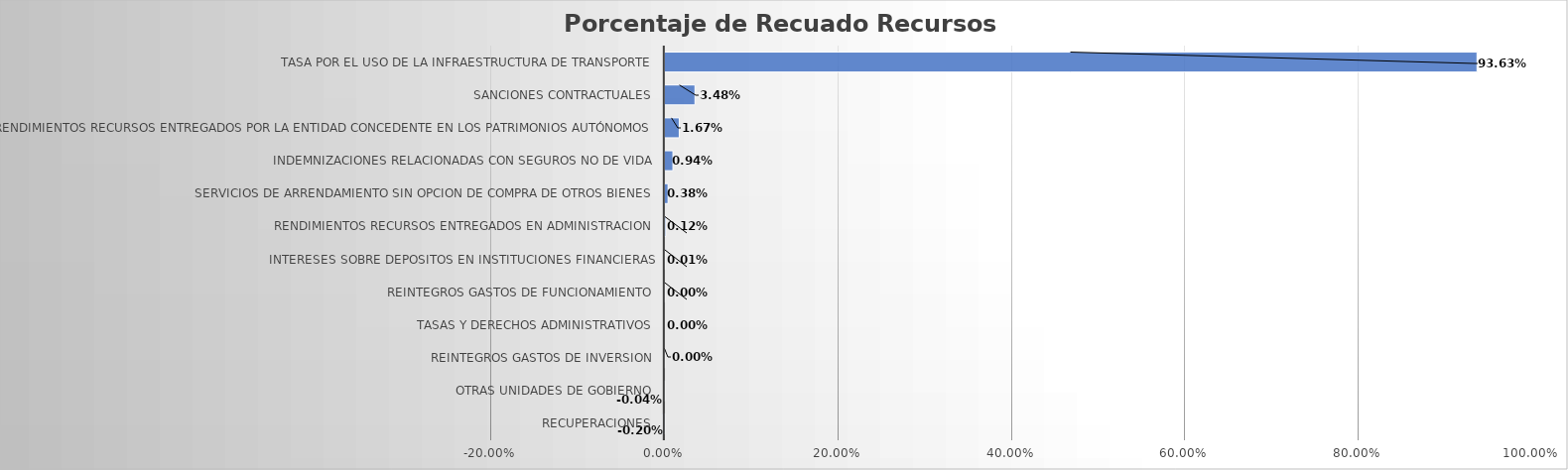
| Category | Total |
|---|---|
| RECUPERACIONES | -0.002 |
| OTRAS UNIDADES DE GOBIERNO | 0 |
| REINTEGROS GASTOS DE INVERSION | 0 |
| TASAS Y DERECHOS ADMINISTRATIVOS | 0 |
| REINTEGROS GASTOS DE FUNCIONAMIENTO | 0 |
| INTERESES SOBRE DEPOSITOS EN INSTITUCIONES FINANCIERAS | 0 |
| RENDIMIENTOS RECURSOS ENTREGADOS EN ADMINISTRACION | 0.001 |
| SERVICIOS DE ARRENDAMIENTO SIN OPCION DE COMPRA DE OTROS BIENES | 0.004 |
| INDEMNIZACIONES RELACIONADAS CON SEGUROS NO DE VIDA | 0.009 |
| RENDIMIENTOS RECURSOS ENTREGADOS POR LA ENTIDAD CONCEDENTE EN LOS PATRIMONIOS AUTÓNOMOS | 0.017 |
| SANCIONES CONTRACTUALES | 0.035 |
| TASA POR EL USO DE LA INFRAESTRUCTURA DE TRANSPORTE | 0.936 |